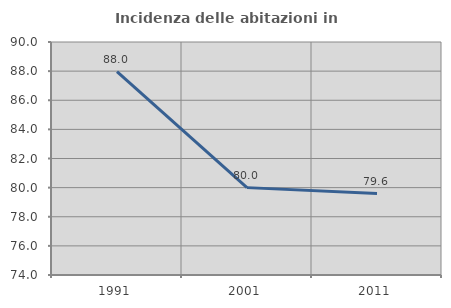
| Category | Incidenza delle abitazioni in proprietà  |
|---|---|
| 1991.0 | 87.963 |
| 2001.0 | 80 |
| 2011.0 | 79.592 |